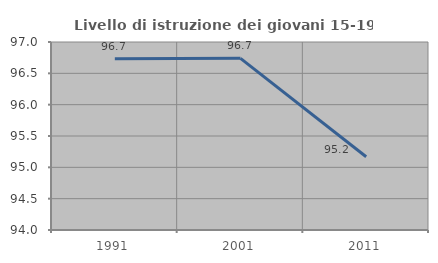
| Category | Livello di istruzione dei giovani 15-19 anni |
|---|---|
| 1991.0 | 96.735 |
| 2001.0 | 96.739 |
| 2011.0 | 95.169 |